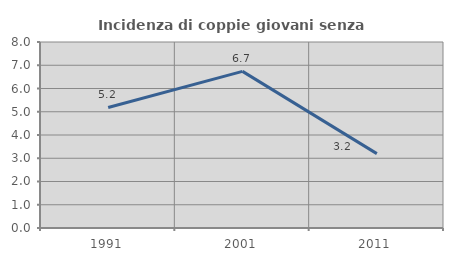
| Category | Incidenza di coppie giovani senza figli |
|---|---|
| 1991.0 | 5.184 |
| 2001.0 | 6.736 |
| 2011.0 | 3.198 |